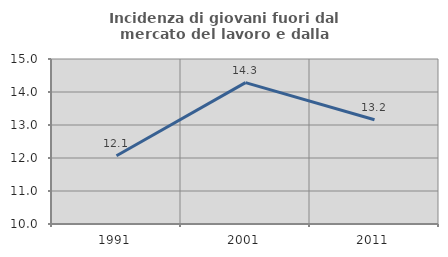
| Category | Incidenza di giovani fuori dal mercato del lavoro e dalla formazione  |
|---|---|
| 1991.0 | 12.069 |
| 2001.0 | 14.286 |
| 2011.0 | 13.158 |